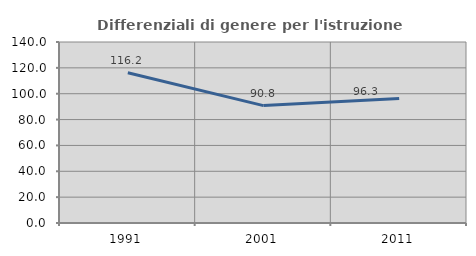
| Category | Differenziali di genere per l'istruzione superiore |
|---|---|
| 1991.0 | 116.165 |
| 2001.0 | 90.802 |
| 2011.0 | 96.285 |